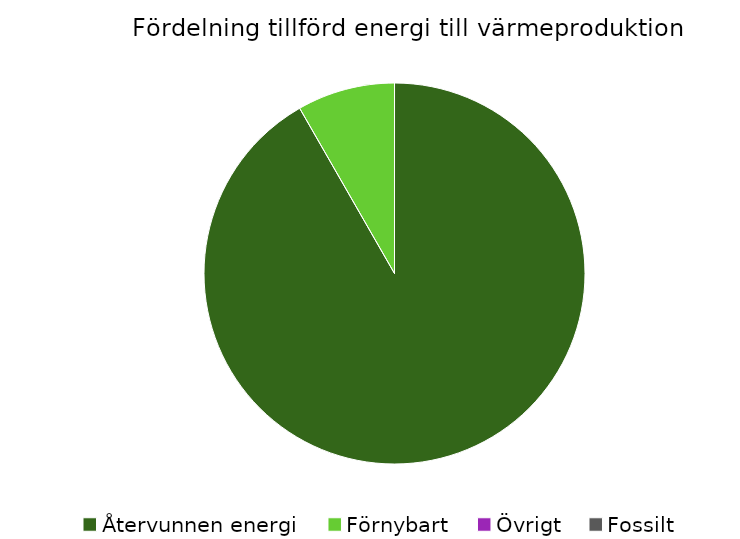
| Category | Fördelning värmeproduktion |
|---|---|
| Återvunnen energi | 0.917 |
| Förnybart | 0.083 |
| Övrigt | 0 |
| Fossilt | 0 |